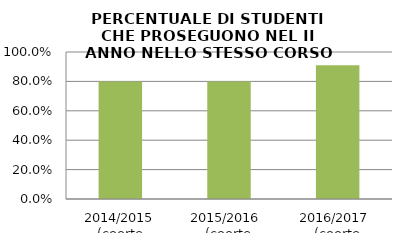
| Category | 2014/2015 (coorte 2013/14) 2015/2016  (coorte 2014/15) 2016/2017  (coorte 2015/16) |
|---|---|
| 2014/2015 (coorte 2013/14) | 0.8 |
| 2015/2016  (coorte 2014/15) | 0.8 |
| 2016/2017  (coorte 2015/16) | 0.909 |